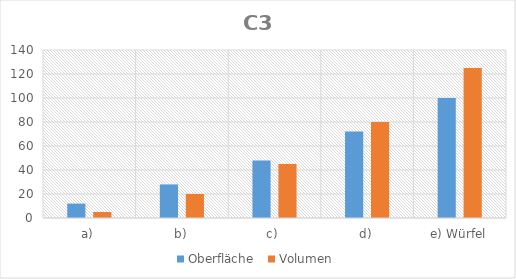
| Category | Oberfläche  | Volumen |
|---|---|---|
| a) | 12 | 5 |
| b) | 28 | 20 |
| c) | 48 | 45 |
| d) | 72 | 80 |
| e) Würfel | 100 | 125 |